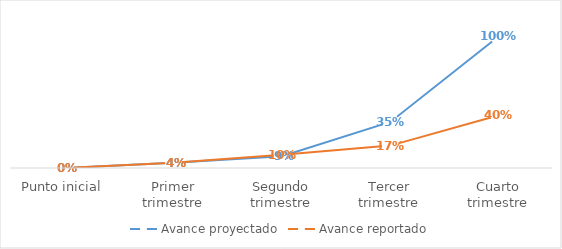
| Category | Avance proyectado | Avance reportado |
|---|---|---|
| Punto inicial | 0 | 0 |
| Primer trimestre | 0.04 | 0.04 |
| Segundo trimestre | 0.09 | 0.1 |
| Tercer trimestre | 0.35 | 0.17 |
| Cuarto trimestre | 1 | 0.4 |